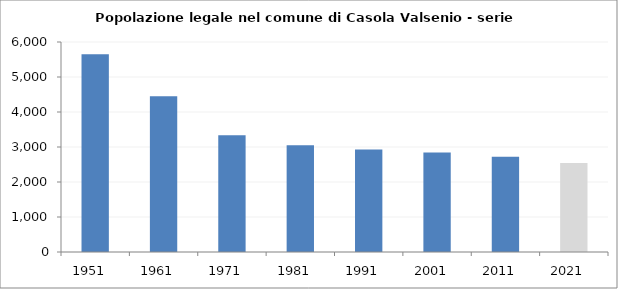
| Category | Popolazione residente |
|---|---|
| 1951   | 5647 |
| 1961   | 4451 |
| 1971   | 3338 |
| 1981   | 3051 |
| 1991   | 2930 |
| 2001   | 2844 |
| 2011   | 2724 |
| 2021   | 2541 |